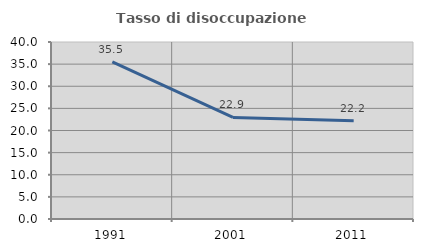
| Category | Tasso di disoccupazione giovanile  |
|---|---|
| 1991.0 | 35.507 |
| 2001.0 | 22.941 |
| 2011.0 | 22.222 |